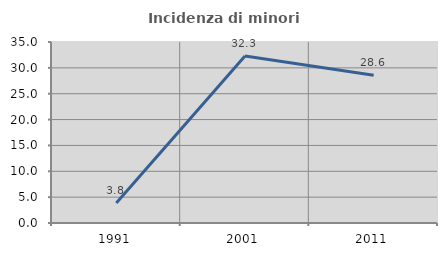
| Category | Incidenza di minori stranieri |
|---|---|
| 1991.0 | 3.846 |
| 2001.0 | 32.275 |
| 2011.0 | 28.571 |